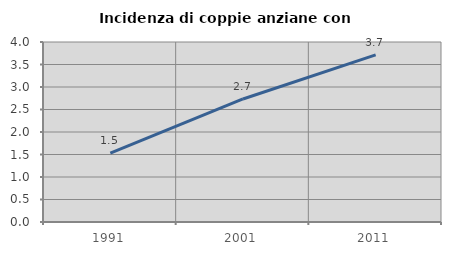
| Category | Incidenza di coppie anziane con figli |
|---|---|
| 1991.0 | 1.531 |
| 2001.0 | 2.734 |
| 2011.0 | 3.713 |